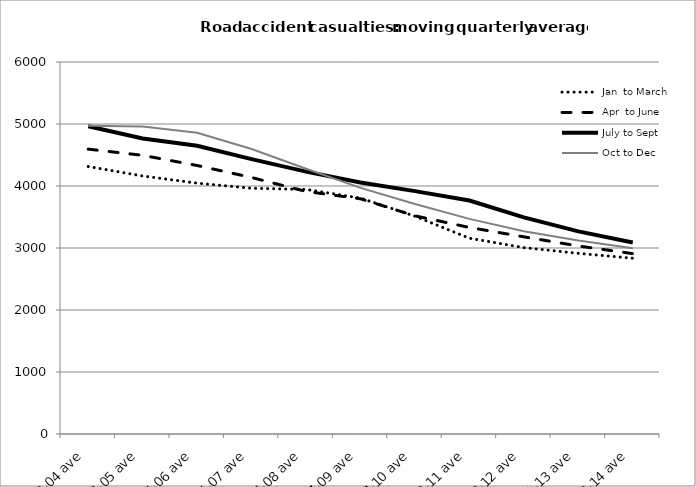
| Category | Jan  to March | Apr  to June | July to Sept | Oct to Dec |
|---|---|---|---|---|
| 2002-04 ave | 4314 | 4594.667 | 4963 | 4972.667 |
| 2003-05 ave | 4161.667 | 4494.667 | 4766 | 4958.667 |
| 2004-06 ave | 4046 | 4330.667 | 4648.667 | 4860 |
| 2005-07 ave | 3963.667 | 4137 | 4433 | 4597.333 |
| 2006-08 ave | 3945 | 3912.333 | 4231.667 | 4277.667 |
| 2007-09 ave | 3804.667 | 3793.667 | 4056.333 | 3970 |
| 2008-10 ave | 3512.667 | 3519 | 3917.667 | 3708.333 |
| 2009-11 ave | 3157.667 | 3331.333 | 3765 | 3469.667 |
| 2010-12 ave | 3006 | 3180 | 3493 | 3269 |
| 2011-13 ave | 2913.667 | 3032.667 | 3268 | 3122.333 |
| 2012-14 ave | 2835 | 2909.333 | 3088.667 | 2996.333 |